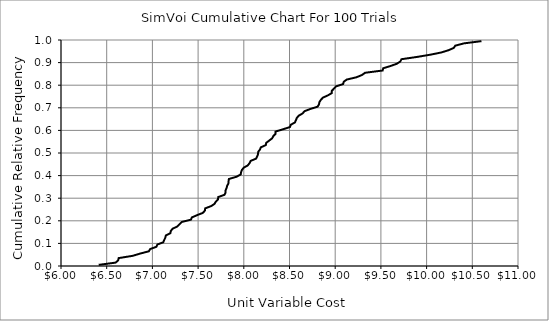
| Category | Series 0 |
|---|---|
| 6.412461766414863 | 0.005 |
| 6.597758075026703 | 0.015 |
| 6.625377284255234 | 0.025 |
| 6.63118055024673 | 0.035 |
| 6.784236433408008 | 0.045 |
| 6.866053827382114 | 0.055 |
| 6.960760332587584 | 0.065 |
| 6.975359096767873 | 0.075 |
| 7.0438523837948 | 0.085 |
| 7.054271388777496 | 0.095 |
| 7.118918414560007 | 0.105 |
| 7.128963195392983 | 0.115 |
| 7.1412601472951 | 0.125 |
| 7.147236327511475 | 0.135 |
| 7.196719318290606 | 0.145 |
| 7.201467640726995 | 0.155 |
| 7.221376723690576 | 0.165 |
| 7.273194652571533 | 0.175 |
| 7.297879118243739 | 0.185 |
| 7.322483061726135 | 0.195 |
| 7.4217532251195735 | 0.205 |
| 7.432071488580894 | 0.215 |
| 7.489083048809267 | 0.225 |
| 7.551469433422725 | 0.235 |
| 7.5745251901715385 | 0.245 |
| 7.577680843721031 | 0.255 |
| 7.642314292760345 | 0.265 |
| 7.679708956540013 | 0.275 |
| 7.69428427379326 | 0.285 |
| 7.718661596310512 | 0.295 |
| 7.719423426696527 | 0.305 |
| 7.787961204840504 | 0.315 |
| 7.80082965003337 | 0.325 |
| 7.8008792750240925 | 0.335 |
| 7.811482448741565 | 0.345 |
| 7.817644752392725 | 0.355 |
| 7.8313111702073375 | 0.365 |
| 7.833156971276349 | 0.375 |
| 7.836890463266036 | 0.385 |
| 7.920935150421331 | 0.395 |
| 7.965956030151336 | 0.405 |
| 7.970406837737856 | 0.415 |
| 7.9795982688006895 | 0.425 |
| 7.999096391088855 | 0.435 |
| 8.042941091310917 | 0.445 |
| 8.062534990859206 | 0.455 |
| 8.07472128533649 | 0.465 |
| 8.134011712817045 | 0.475 |
| 8.14617908735314 | 0.485 |
| 8.156055103904192 | 0.495 |
| 8.157255140924462 | 0.505 |
| 8.176340179564193 | 0.515 |
| 8.18654853860172 | 0.525 |
| 8.24025815329633 | 0.535 |
| 8.245654359947244 | 0.545 |
| 8.277950662160677 | 0.555 |
| 8.310356491929902 | 0.565 |
| 8.322798937939595 | 0.575 |
| 8.347905742809601 | 0.585 |
| 8.348073995229859 | 0.595 |
| 8.429496647251241 | 0.605 |
| 8.505475958668336 | 0.615 |
| 8.51369282584637 | 0.625 |
| 8.558672436460132 | 0.635 |
| 8.570173434086822 | 0.645 |
| 8.5799233662857 | 0.655 |
| 8.600419279409046 | 0.665 |
| 8.643014296777642 | 0.675 |
| 8.664326146974176 | 0.685 |
| 8.729084537025106 | 0.695 |
| 8.807678212906168 | 0.705 |
| 8.822264579407284 | 0.715 |
| 8.82716989691528 | 0.725 |
| 8.842556173277387 | 0.735 |
| 8.865515044995588 | 0.745 |
| 8.920333096546887 | 0.755 |
| 8.962169920184742 | 0.765 |
| 8.963035757919336 | 0.775 |
| 8.98643888838562 | 0.785 |
| 9.009559051875458 | 0.795 |
| 9.086596772953316 | 0.805 |
| 9.092834100716615 | 0.815 |
| 9.126457782483506 | 0.825 |
| 9.23186368257091 | 0.835 |
| 9.292115899744925 | 0.845 |
| 9.326992812133225 | 0.855 |
| 9.518861166413696 | 0.865 |
| 9.52524895477391 | 0.875 |
| 9.605819153306468 | 0.885 |
| 9.674772377563313 | 0.895 |
| 9.71253204860519 | 0.905 |
| 9.724901645840218 | 0.915 |
| 9.894085944671128 | 0.925 |
| 10.04098471025165 | 0.935 |
| 10.162434953613667 | 0.945 |
| 10.241340660086065 | 0.955 |
| 10.296987174791745 | 0.965 |
| 10.313668248811222 | 0.975 |
| 10.407936328515019 | 0.985 |
| 10.599768073922213 | 0.995 |